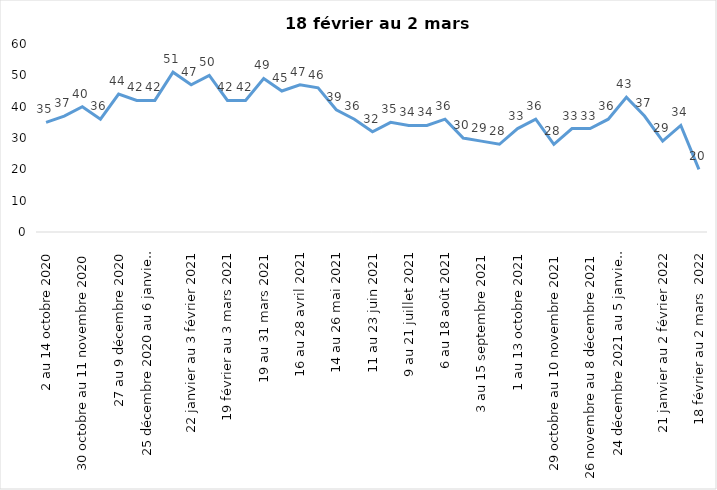
| Category | Toujours aux trois mesures |
|---|---|
| 2 au 14 octobre 2020 | 35 |
| 16 au 28 octobre 2020 | 37 |
| 30 octobre au 11 novembre 2020 | 40 |
| 13 au 25 novembre 2020 | 36 |
| 27 au 9 décembre 2020 | 44 |
| 11 au 25 décembre 2020 | 42 |
| 25 décembre 2020 au 6 janvier 2021 | 42 |
| 8 au 20 janvier 2021 | 51 |
| 22 janvier au 3 février 2021 | 47 |
| 5 au 17 février 2021 | 50 |
| 19 février au 3 mars 2021 | 42 |
| 5 au 17 mars 2021 | 42 |
| 19 au 31 mars 2021 | 49 |
| 2 au 14 avril 2021 | 45 |
| 16 au 28 avril 2021 | 47 |
| 30 avril au 12 mai 2021 | 46 |
| 14 au 26 mai 2021 | 39 |
| 28 mai au 9 juin 2021 | 36 |
| 11 au 23 juin 2021 | 32 |
| 25 juin au 7 juillet 2021 | 35 |
| 9 au 21 juillet 2021 | 34 |
| 23 au 4 août 2021 | 34 |
| 6 au 18 août 2021 | 36 |
| 20 août au 1er septembre 2021 | 30 |
| 3 au 15 septembre 2021 | 29 |
| 17 au 29 septembre 2021 | 28 |
| 1 au 13 octobre 2021 | 33 |
| 15 au 27 octobre 2021 | 36 |
| 29 octobre au 10 novembre 2021 | 28 |
| 12 au 24 novembre 2021 | 33 |
| 26 novembre au 8 décembre 2021 | 33 |
| 10 au 22 décembre 2021 | 36 |
| 24 décembre 2021 au 5 janvier 2022 2022 | 43 |
| 7 au 19 janvier 2022 | 37 |
| 21 janvier au 2 février 2022 | 29 |
| 4 au 16 février 2022 | 34 |
| 18 février au 2 mars  2022 | 20 |